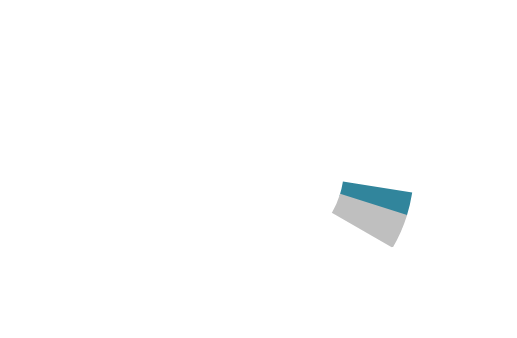
| Category | Series 0 |
|---|---|
| 0 | 36649305 |
| 1 | 15195441 |
| 2 | 1290527 |
| 3 | 1909595 |